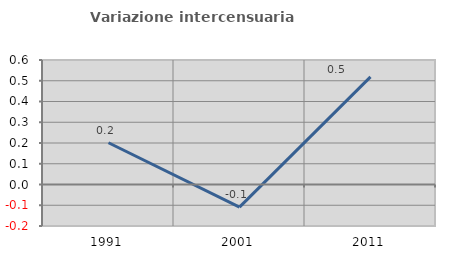
| Category | Variazione intercensuaria annua |
|---|---|
| 1991.0 | 0.201 |
| 2001.0 | -0.109 |
| 2011.0 | 0.518 |